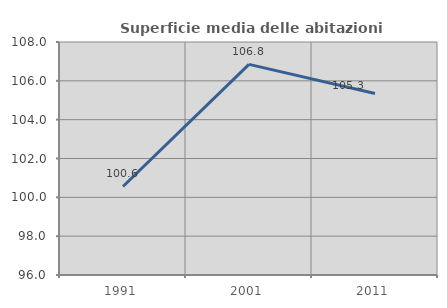
| Category | Superficie media delle abitazioni occupate |
|---|---|
| 1991.0 | 100.558 |
| 2001.0 | 106.846 |
| 2011.0 | 105.347 |